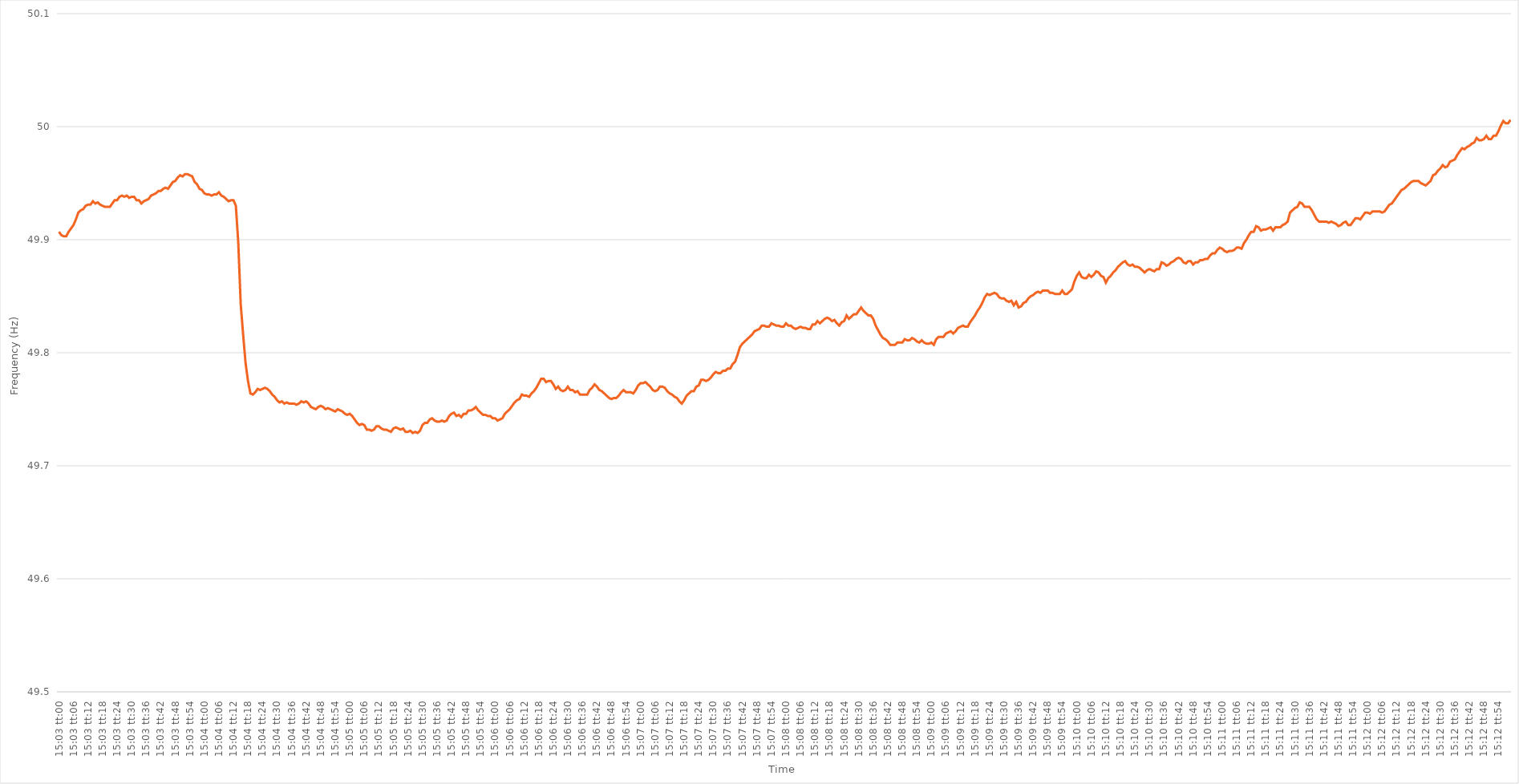
| Category | Series 0 |
|---|---|
| 0.6270833333333333 | 49.907 |
| 0.6270949074074074 | 49.904 |
| 0.6271064814814815 | 49.903 |
| 0.6271180555555556 | 49.903 |
| 0.6271296296296297 | 49.907 |
| 0.6271412037037037 | 49.91 |
| 0.6271527777777778 | 49.913 |
| 0.6271643518518518 | 49.918 |
| 0.6271759259259259 | 49.924 |
| 0.6271875 | 49.926 |
| 0.627199074074074 | 49.927 |
| 0.6272106481481482 | 49.93 |
| 0.6272222222222222 | 49.931 |
| 0.6272337962962963 | 49.931 |
| 0.6272453703703703 | 49.934 |
| 0.6272569444444445 | 49.932 |
| 0.6272685185185185 | 49.933 |
| 0.6272800925925927 | 49.931 |
| 0.6272916666666667 | 49.93 |
| 0.6273032407407407 | 49.929 |
| 0.6273148148148148 | 49.929 |
| 0.6273263888888889 | 49.929 |
| 0.627337962962963 | 49.932 |
| 0.6273495370370371 | 49.935 |
| 0.6273611111111111 | 49.935 |
| 0.6273726851851852 | 49.938 |
| 0.6273842592592592 | 49.939 |
| 0.6273958333333333 | 49.938 |
| 0.6274074074074074 | 49.939 |
| 0.6274189814814815 | 49.937 |
| 0.6274305555555556 | 49.938 |
| 0.6274421296296296 | 49.938 |
| 0.6274537037037037 | 49.935 |
| 0.6274652777777777 | 49.935 |
| 0.6274768518518519 | 49.932 |
| 0.6274884259259259 | 49.934 |
| 0.6275000000000001 | 49.935 |
| 0.6275115740740741 | 49.936 |
| 0.6275231481481481 | 49.939 |
| 0.6275347222222222 | 49.94 |
| 0.6275462962962963 | 49.941 |
| 0.6275578703703704 | 49.943 |
| 0.6275694444444445 | 49.943 |
| 0.6275810185185186 | 49.945 |
| 0.6275925925925926 | 49.946 |
| 0.6276041666666666 | 49.945 |
| 0.6276157407407407 | 49.948 |
| 0.6276273148148148 | 49.951 |
| 0.6276388888888889 | 49.952 |
| 0.627650462962963 | 49.955 |
| 0.627662037037037 | 49.957 |
| 0.6276736111111111 | 49.956 |
| 0.6276851851851851 | 49.958 |
| 0.6276967592592593 | 49.958 |
| 0.6277083333333333 | 49.957 |
| 0.6277199074074075 | 49.956 |
| 0.6277314814814815 | 49.951 |
| 0.6277430555555555 | 49.949 |
| 0.6277546296296296 | 49.945 |
| 0.6277662037037037 | 49.944 |
| 0.6277777777777778 | 49.941 |
| 0.6277893518518519 | 49.94 |
| 0.627800925925926 | 49.94 |
| 0.6278125 | 49.939 |
| 0.627824074074074 | 49.94 |
| 0.6278356481481482 | 49.94 |
| 0.6278472222222222 | 49.942 |
| 0.6278587962962963 | 49.939 |
| 0.6278703703703704 | 49.938 |
| 0.6278819444444445 | 49.936 |
| 0.6278935185185185 | 49.934 |
| 0.6279050925925925 | 49.935 |
| 0.6279166666666667 | 49.935 |
| 0.6279282407407407 | 49.93 |
| 0.6279398148148149 | 49.897 |
| 0.6279513888888889 | 49.843 |
| 0.627962962962963 | 49.816 |
| 0.627974537037037 | 49.791 |
| 0.6279861111111111 | 49.775 |
| 0.6279976851851852 | 49.764 |
| 0.6280092592592593 | 49.763 |
| 0.6280208333333334 | 49.765 |
| 0.6280324074074074 | 49.768 |
| 0.6280439814814814 | 49.767 |
| 0.6280555555555556 | 49.768 |
| 0.6280671296296296 | 49.769 |
| 0.6280787037037037 | 49.768 |
| 0.6280902777777778 | 49.766 |
| 0.6281018518518519 | 49.763 |
| 0.6281134259259259 | 49.761 |
| 0.6281249999999999 | 49.758 |
| 0.6281365740740741 | 49.756 |
| 0.6281481481481481 | 49.757 |
| 0.6281597222222223 | 49.755 |
| 0.6281712962962963 | 49.756 |
| 0.6281828703703703 | 49.755 |
| 0.6281944444444444 | 49.755 |
| 0.6282060185185185 | 49.755 |
| 0.6282175925925926 | 49.754 |
| 0.6282291666666667 | 49.755 |
| 0.6282407407407408 | 49.757 |
| 0.6282523148148148 | 49.756 |
| 0.6282638888888888 | 49.757 |
| 0.628275462962963 | 49.755 |
| 0.628287037037037 | 49.752 |
| 0.6282986111111112 | 49.751 |
| 0.6283101851851852 | 49.75 |
| 0.6283217592592593 | 49.752 |
| 0.6283333333333333 | 49.753 |
| 0.6283449074074073 | 49.752 |
| 0.6283564814814815 | 49.75 |
| 0.6283680555555555 | 49.751 |
| 0.6283796296296297 | 49.75 |
| 0.6283912037037037 | 49.749 |
| 0.6284027777777778 | 49.748 |
| 0.6284143518518518 | 49.75 |
| 0.6284259259259259 | 49.749 |
| 0.6284375 | 49.748 |
| 0.6284490740740741 | 49.746 |
| 0.6284606481481482 | 49.745 |
| 0.6284722222222222 | 49.746 |
| 0.6284837962962962 | 49.744 |
| 0.6284953703703704 | 49.741 |
| 0.6285069444444444 | 49.738 |
| 0.6285185185185186 | 49.736 |
| 0.6285300925925926 | 49.737 |
| 0.6285416666666667 | 49.736 |
| 0.6285532407407407 | 49.732 |
| 0.6285648148148147 | 49.732 |
| 0.6285763888888889 | 49.731 |
| 0.6285879629629629 | 49.732 |
| 0.6285995370370371 | 49.735 |
| 0.6286111111111111 | 49.735 |
| 0.6286226851851852 | 49.733 |
| 0.6286342592592592 | 49.732 |
| 0.6286458333333333 | 49.732 |
| 0.6286574074074074 | 49.731 |
| 0.6286689814814815 | 49.73 |
| 0.6286805555555556 | 49.733 |
| 0.6286921296296296 | 49.734 |
| 0.6287037037037037 | 49.733 |
| 0.6287152777777778 | 49.732 |
| 0.6287268518518518 | 49.733 |
| 0.628738425925926 | 49.73 |
| 0.62875 | 49.73 |
| 0.6287615740740741 | 49.731 |
| 0.6287731481481481 | 49.729 |
| 0.6287847222222223 | 49.73 |
| 0.6287962962962963 | 49.729 |
| 0.6288078703703703 | 49.731 |
| 0.6288194444444445 | 49.736 |
| 0.6288310185185185 | 49.738 |
| 0.6288425925925926 | 49.738 |
| 0.6288541666666666 | 49.741 |
| 0.6288657407407408 | 49.742 |
| 0.6288773148148148 | 49.74 |
| 0.6288888888888889 | 49.739 |
| 0.628900462962963 | 49.739 |
| 0.628912037037037 | 49.74 |
| 0.6289236111111111 | 49.739 |
| 0.6289351851851852 | 49.74 |
| 0.6289467592592592 | 49.744 |
| 0.6289583333333334 | 49.746 |
| 0.6289699074074074 | 49.747 |
| 0.6289814814814815 | 49.744 |
| 0.6289930555555555 | 49.745 |
| 0.6290046296296297 | 49.743 |
| 0.6290162037037037 | 49.746 |
| 0.6290277777777777 | 49.746 |
| 0.6290393518518519 | 49.749 |
| 0.6290509259259259 | 49.749 |
| 0.6290625 | 49.75 |
| 0.629074074074074 | 49.752 |
| 0.6290856481481482 | 49.749 |
| 0.6290972222222222 | 49.747 |
| 0.6291087962962963 | 49.745 |
| 0.6291203703703704 | 49.745 |
| 0.6291319444444444 | 49.744 |
| 0.6291435185185185 | 49.744 |
| 0.6291550925925926 | 49.742 |
| 0.6291666666666667 | 49.742 |
| 0.6291782407407408 | 49.74 |
| 0.6291898148148148 | 49.741 |
| 0.6292013888888889 | 49.742 |
| 0.6292129629629629 | 49.746 |
| 0.6292245370370371 | 49.748 |
| 0.6292361111111111 | 49.75 |
| 0.6292476851851853 | 49.753 |
| 0.6292592592592593 | 49.756 |
| 0.6292708333333333 | 49.758 |
| 0.6292824074074074 | 49.759 |
| 0.6292939814814814 | 49.763 |
| 0.6293055555555556 | 49.762 |
| 0.6293171296296296 | 49.762 |
| 0.6293287037037038 | 49.761 |
| 0.6293402777777778 | 49.764 |
| 0.6293518518518518 | 49.766 |
| 0.6293634259259259 | 49.769 |
| 0.629375 | 49.773 |
| 0.6293865740740741 | 49.777 |
| 0.6293981481481482 | 49.777 |
| 0.6294097222222222 | 49.774 |
| 0.6294212962962963 | 49.775 |
| 0.6294328703703703 | 49.775 |
| 0.6294444444444445 | 49.772 |
| 0.6294560185185185 | 49.768 |
| 0.6294675925925927 | 49.77 |
| 0.6294791666666667 | 49.767 |
| 0.6294907407407407 | 49.766 |
| 0.6295023148148148 | 49.767 |
| 0.6295138888888888 | 49.77 |
| 0.629525462962963 | 49.767 |
| 0.629537037037037 | 49.767 |
| 0.6295486111111112 | 49.765 |
| 0.6295601851851852 | 49.766 |
| 0.6295717592592592 | 49.763 |
| 0.6295833333333333 | 49.763 |
| 0.6295949074074074 | 49.763 |
| 0.6296064814814815 | 49.763 |
| 0.6296180555555556 | 49.767 |
| 0.6296296296296297 | 49.769 |
| 0.6296412037037037 | 49.772 |
| 0.6296527777777777 | 49.77 |
| 0.6296643518518519 | 49.767 |
| 0.6296759259259259 | 49.766 |
| 0.6296875000000001 | 49.764 |
| 0.6296990740740741 | 49.762 |
| 0.6297106481481481 | 49.76 |
| 0.6297222222222222 | 49.759 |
| 0.6297337962962963 | 49.76 |
| 0.6297453703703704 | 49.76 |
| 0.6297569444444444 | 49.762 |
| 0.6297685185185186 | 49.765 |
| 0.6297800925925926 | 49.767 |
| 0.6297916666666666 | 49.765 |
| 0.6298032407407407 | 49.765 |
| 0.6298148148148148 | 49.765 |
| 0.6298263888888889 | 49.764 |
| 0.629837962962963 | 49.767 |
| 0.629849537037037 | 49.771 |
| 0.6298611111111111 | 49.773 |
| 0.6298726851851851 | 49.773 |
| 0.6298842592592593 | 49.774 |
| 0.6298958333333333 | 49.772 |
| 0.6299074074074075 | 49.77 |
| 0.6299189814814815 | 49.767 |
| 0.6299305555555555 | 49.766 |
| 0.6299421296296296 | 49.767 |
| 0.6299537037037037 | 49.77 |
| 0.6299652777777778 | 49.77 |
| 0.6299768518518518 | 49.769 |
| 0.629988425925926 | 49.766 |
| 0.63 | 49.764 |
| 0.630011574074074 | 49.763 |
| 0.6300231481481481 | 49.761 |
| 0.6300347222222222 | 49.76 |
| 0.6300462962962963 | 49.757 |
| 0.6300578703703704 | 49.755 |
| 0.6300694444444445 | 49.758 |
| 0.6300810185185185 | 49.762 |
| 0.6300925925925925 | 49.764 |
| 0.6301041666666667 | 49.766 |
| 0.6301157407407407 | 49.766 |
| 0.6301273148148149 | 49.77 |
| 0.6301388888888889 | 49.771 |
| 0.630150462962963 | 49.776 |
| 0.630162037037037 | 49.776 |
| 0.6301736111111111 | 49.775 |
| 0.6301851851851852 | 49.776 |
| 0.6301967592592593 | 49.778 |
| 0.6302083333333334 | 49.781 |
| 0.6302199074074074 | 49.783 |
| 0.6302314814814814 | 49.782 |
| 0.6302430555555555 | 49.782 |
| 0.6302546296296296 | 49.784 |
| 0.6302662037037037 | 49.784 |
| 0.6302777777777778 | 49.786 |
| 0.6302893518518519 | 49.786 |
| 0.6303009259259259 | 49.79 |
| 0.6303124999999999 | 49.792 |
| 0.6303240740740741 | 49.798 |
| 0.6303356481481481 | 49.805 |
| 0.6303472222222223 | 49.808 |
| 0.6303587962962963 | 49.81 |
| 0.6303703703703704 | 49.812 |
| 0.6303819444444444 | 49.814 |
| 0.6303935185185185 | 49.816 |
| 0.6304050925925926 | 49.819 |
| 0.6304166666666667 | 49.82 |
| 0.6304282407407408 | 49.821 |
| 0.6304398148148148 | 49.824 |
| 0.6304513888888889 | 49.824 |
| 0.6304629629629629 | 49.823 |
| 0.630474537037037 | 49.823 |
| 0.6304861111111111 | 49.826 |
| 0.6304976851851852 | 49.825 |
| 0.6305092592592593 | 49.824 |
| 0.6305208333333333 | 49.824 |
| 0.6305324074074073 | 49.823 |
| 0.6305439814814815 | 49.823 |
| 0.6305555555555555 | 49.826 |
| 0.6305671296296297 | 49.824 |
| 0.6305787037037037 | 49.824 |
| 0.6305902777777778 | 49.822 |
| 0.6306018518518518 | 49.821 |
| 0.630613425925926 | 49.822 |
| 0.630625 | 49.823 |
| 0.6306365740740741 | 49.822 |
| 0.6306481481481482 | 49.822 |
| 0.6306597222222222 | 49.821 |
| 0.6306712962962963 | 49.821 |
| 0.6306828703703703 | 49.825 |
| 0.6306944444444444 | 49.825 |
| 0.6307060185185185 | 49.828 |
| 0.6307175925925926 | 49.826 |
| 0.6307291666666667 | 49.828 |
| 0.6307407407407407 | 49.83 |
| 0.6307523148148148 | 49.831 |
| 0.6307638888888889 | 49.83 |
| 0.6307754629629629 | 49.828 |
| 0.6307870370370371 | 49.829 |
| 0.6307986111111111 | 49.826 |
| 0.6308101851851852 | 49.824 |
| 0.6308217592592592 | 49.827 |
| 0.6308333333333334 | 49.828 |
| 0.6308449074074074 | 49.833 |
| 0.6308564814814815 | 49.83 |
| 0.6308680555555556 | 49.832 |
| 0.6308796296296296 | 49.834 |
| 0.6308912037037037 | 49.834 |
| 0.6309027777777778 | 49.837 |
| 0.6309143518518519 | 49.84 |
| 0.6309259259259259 | 49.837 |
| 0.6309375 | 49.835 |
| 0.6309490740740741 | 49.833 |
| 0.6309606481481481 | 49.833 |
| 0.6309722222222222 | 49.83 |
| 0.6309837962962963 | 49.824 |
| 0.6309953703703703 | 49.82 |
| 0.6310069444444445 | 49.816 |
| 0.6310185185185185 | 49.813 |
| 0.6310300925925926 | 49.812 |
| 0.6310416666666666 | 49.81 |
| 0.6310532407407408 | 49.807 |
| 0.6310648148148148 | 49.807 |
| 0.631076388888889 | 49.807 |
| 0.631087962962963 | 49.809 |
| 0.631099537037037 | 49.809 |
| 0.6311111111111111 | 49.809 |
| 0.6311226851851852 | 49.812 |
| 0.6311342592592593 | 49.811 |
| 0.6311458333333334 | 49.811 |
| 0.6311574074074074 | 49.813 |
| 0.6311689814814815 | 49.812 |
| 0.6311805555555555 | 49.81 |
| 0.6311921296296296 | 49.809 |
| 0.6312037037037037 | 49.811 |
| 0.6312152777777778 | 49.809 |
| 0.6312268518518519 | 49.808 |
| 0.6312384259259259 | 49.808 |
| 0.63125 | 49.809 |
| 0.631261574074074 | 49.807 |
| 0.6312731481481482 | 49.812 |
| 0.6312847222222222 | 49.814 |
| 0.6312962962962964 | 49.814 |
| 0.6313078703703704 | 49.814 |
| 0.6313194444444444 | 49.817 |
| 0.6313310185185185 | 49.818 |
| 0.6313425925925926 | 49.819 |
| 0.6313541666666667 | 49.817 |
| 0.6313657407407408 | 49.819 |
| 0.6313773148148148 | 49.822 |
| 0.6313888888888889 | 49.823 |
| 0.6314004629629629 | 49.824 |
| 0.631412037037037 | 49.823 |
| 0.6314236111111111 | 49.823 |
| 0.6314351851851852 | 49.827 |
| 0.6314467592592593 | 49.83 |
| 0.6314583333333333 | 49.833 |
| 0.6314699074074074 | 49.837 |
| 0.6314814814814814 | 49.84 |
| 0.6314930555555556 | 49.844 |
| 0.6315046296296296 | 49.849 |
| 0.6315162037037038 | 49.852 |
| 0.6315277777777778 | 49.851 |
| 0.6315393518518518 | 49.852 |
| 0.6315509259259259 | 49.853 |
| 0.6315625 | 49.852 |
| 0.6315740740740741 | 49.849 |
| 0.6315856481481482 | 49.848 |
| 0.6315972222222223 | 49.848 |
| 0.6316087962962963 | 49.846 |
| 0.6316203703703703 | 49.845 |
| 0.6316319444444445 | 49.846 |
| 0.6316435185185185 | 49.842 |
| 0.6316550925925926 | 49.845 |
| 0.6316666666666667 | 49.84 |
| 0.6316782407407407 | 49.841 |
| 0.6316898148148148 | 49.844 |
| 0.6317013888888888 | 49.845 |
| 0.631712962962963 | 49.848 |
| 0.631724537037037 | 49.85 |
| 0.6317361111111112 | 49.851 |
| 0.6317476851851852 | 49.853 |
| 0.6317592592592592 | 49.854 |
| 0.6317708333333333 | 49.853 |
| 0.6317824074074074 | 49.855 |
| 0.6317939814814815 | 49.855 |
| 0.6318055555555556 | 49.855 |
| 0.6318171296296297 | 49.853 |
| 0.6318287037037037 | 49.853 |
| 0.6318402777777777 | 49.852 |
| 0.6318518518518519 | 49.852 |
| 0.6318634259259259 | 49.852 |
| 0.631875 | 49.855 |
| 0.6318865740740741 | 49.852 |
| 0.6318981481481482 | 49.852 |
| 0.6319097222222222 | 49.854 |
| 0.6319212962962962 | 49.856 |
| 0.6319328703703704 | 49.863 |
| 0.6319444444444444 | 49.868 |
| 0.6319560185185186 | 49.871 |
| 0.6319675925925926 | 49.867 |
| 0.6319791666666666 | 49.866 |
| 0.6319907407407407 | 49.866 |
| 0.6320023148148148 | 49.869 |
| 0.6320138888888889 | 49.867 |
| 0.632025462962963 | 49.869 |
| 0.6320370370370371 | 49.872 |
| 0.6320486111111111 | 49.871 |
| 0.6320601851851851 | 49.868 |
| 0.6320717592592593 | 49.867 |
| 0.6320833333333333 | 49.862 |
| 0.6320949074074075 | 49.866 |
| 0.6321064814814815 | 49.868 |
| 0.6321180555555556 | 49.871 |
| 0.6321296296296296 | 49.873 |
| 0.6321412037037036 | 49.876 |
| 0.6321527777777778 | 49.878 |
| 0.6321643518518518 | 49.88 |
| 0.632175925925926 | 49.881 |
| 0.6321875 | 49.878 |
| 0.632199074074074 | 49.877 |
| 0.6322106481481481 | 49.878 |
| 0.6322222222222222 | 49.876 |
| 0.6322337962962963 | 49.876 |
| 0.6322453703703704 | 49.875 |
| 0.6322569444444445 | 49.873 |
| 0.6322685185185185 | 49.871 |
| 0.6322800925925925 | 49.873 |
| 0.6322916666666667 | 49.874 |
| 0.6323032407407407 | 49.873 |
| 0.6323148148148149 | 49.872 |
| 0.6323263888888889 | 49.874 |
| 0.632337962962963 | 49.874 |
| 0.632349537037037 | 49.88 |
| 0.632361111111111 | 49.879 |
| 0.6323726851851852 | 49.877 |
| 0.6323842592592592 | 49.878 |
| 0.6323958333333334 | 49.88 |
| 0.6324074074074074 | 49.881 |
| 0.6324189814814815 | 49.883 |
| 0.6324305555555555 | 49.884 |
| 0.6324421296296296 | 49.883 |
| 0.6324537037037037 | 49.88 |
| 0.6324652777777778 | 49.879 |
| 0.6324768518518519 | 49.881 |
| 0.6324884259259259 | 49.881 |
| 0.6325 | 49.878 |
| 0.6325115740740741 | 49.88 |
| 0.6325231481481481 | 49.88 |
| 0.6325347222222223 | 49.882 |
| 0.6325462962962963 | 49.882 |
| 0.6325578703703704 | 49.883 |
| 0.6325694444444444 | 49.883 |
| 0.6325810185185184 | 49.886 |
| 0.6325925925925926 | 49.888 |
| 0.6326041666666666 | 49.888 |
| 0.6326157407407408 | 49.891 |
| 0.6326273148148148 | 49.893 |
| 0.6326388888888889 | 49.892 |
| 0.6326504629629629 | 49.89 |
| 0.632662037037037 | 49.889 |
| 0.6326736111111111 | 49.89 |
| 0.6326851851851852 | 49.89 |
| 0.6326967592592593 | 49.891 |
| 0.6327083333333333 | 49.893 |
| 0.6327199074074074 | 49.893 |
| 0.6327314814814815 | 49.892 |
| 0.6327430555555555 | 49.897 |
| 0.6327546296296297 | 49.9 |
| 0.6327662037037037 | 49.904 |
| 0.6327777777777778 | 49.907 |
| 0.6327893518518518 | 49.907 |
| 0.632800925925926 | 49.912 |
| 0.6328125 | 49.911 |
| 0.632824074074074 | 49.908 |
| 0.6328356481481482 | 49.909 |
| 0.6328472222222222 | 49.909 |
| 0.6328587962962963 | 49.91 |
| 0.6328703703703703 | 49.911 |
| 0.6328819444444445 | 49.908 |
| 0.6328935185185185 | 49.911 |
| 0.6329050925925926 | 49.911 |
| 0.6329166666666667 | 49.911 |
| 0.6329282407407407 | 49.913 |
| 0.6329398148148148 | 49.914 |
| 0.6329513888888889 | 49.916 |
| 0.632962962962963 | 49.924 |
| 0.6329745370370371 | 49.926 |
| 0.6329861111111111 | 49.928 |
| 0.6329976851851852 | 49.929 |
| 0.6330092592592592 | 49.933 |
| 0.6330208333333334 | 49.932 |
| 0.6330324074074074 | 49.929 |
| 0.6330439814814816 | 49.929 |
| 0.6330555555555556 | 49.929 |
| 0.6330671296296296 | 49.926 |
| 0.6330787037037037 | 49.922 |
| 0.6330902777777777 | 49.918 |
| 0.6331018518518519 | 49.916 |
| 0.6331134259259259 | 49.916 |
| 0.633125 | 49.916 |
| 0.6331365740740741 | 49.916 |
| 0.6331481481481481 | 49.915 |
| 0.6331597222222222 | 49.916 |
| 0.6331712962962963 | 49.915 |
| 0.6331828703703704 | 49.914 |
| 0.6331944444444445 | 49.912 |
| 0.6332060185185185 | 49.913 |
| 0.6332175925925926 | 49.915 |
| 0.6332291666666666 | 49.916 |
| 0.6332407407407408 | 49.913 |
| 0.6332523148148148 | 49.913 |
| 0.633263888888889 | 49.916 |
| 0.633275462962963 | 49.919 |
| 0.633287037037037 | 49.919 |
| 0.6332986111111111 | 49.918 |
| 0.6333101851851851 | 49.921 |
| 0.6333217592592593 | 49.924 |
| 0.6333333333333333 | 49.924 |
| 0.6333449074074075 | 49.923 |
| 0.6333564814814815 | 49.925 |
| 0.6333680555555555 | 49.925 |
| 0.6333796296296296 | 49.925 |
| 0.6333912037037037 | 49.925 |
| 0.6334027777777778 | 49.924 |
| 0.6334143518518519 | 49.925 |
| 0.633425925925926 | 49.928 |
| 0.6334375 | 49.931 |
| 0.633449074074074 | 49.932 |
| 0.6334606481481482 | 49.935 |
| 0.6334722222222222 | 49.938 |
| 0.6334837962962964 | 49.941 |
| 0.6334953703703704 | 49.944 |
| 0.6335069444444444 | 49.945 |
| 0.6335185185185185 | 49.947 |
| 0.6335300925925925 | 49.949 |
| 0.6335416666666667 | 49.951 |
| 0.6335532407407407 | 49.952 |
| 0.6335648148148149 | 49.952 |
| 0.6335763888888889 | 49.952 |
| 0.6335879629629629 | 49.95 |
| 0.633599537037037 | 49.949 |
| 0.6336111111111111 | 49.948 |
| 0.6336226851851852 | 49.95 |
| 0.6336342592592593 | 49.952 |
| 0.6336458333333334 | 49.957 |
| 0.6336574074074074 | 49.958 |
| 0.6336689814814814 | 49.961 |
| 0.6336805555555556 | 49.963 |
| 0.6336921296296296 | 49.966 |
| 0.6337037037037038 | 49.964 |
| 0.6337152777777778 | 49.965 |
| 0.6337268518518518 | 49.969 |
| 0.6337384259259259 | 49.97 |
| 0.63375 | 49.971 |
| 0.6337615740740741 | 49.975 |
| 0.6337731481481481 | 49.978 |
| 0.6337847222222223 | 49.981 |
| 0.6337962962962963 | 49.98 |
| 0.6338078703703703 | 49.982 |
| 0.6338194444444444 | 49.983 |
| 0.6338310185185185 | 49.985 |
| 0.6338425925925926 | 49.986 |
| 0.6338541666666667 | 49.99 |
| 0.6338657407407408 | 49.988 |
| 0.6338773148148148 | 49.988 |
| 0.6338888888888888 | 49.989 |
| 0.633900462962963 | 49.992 |
| 0.633912037037037 | 49.989 |
| 0.6339236111111112 | 49.989 |
| 0.6339351851851852 | 49.992 |
| 0.6339467592592593 | 49.992 |
| 0.6339583333333333 | 49.996 |
| 0.6339699074074074 | 50.001 |
| 0.6339814814814815 | 50.005 |
| 0.6339930555555555 | 50.003 |
| 0.6340046296296297 | 50.003 |
| 0.6340162037037037 | 50.006 |